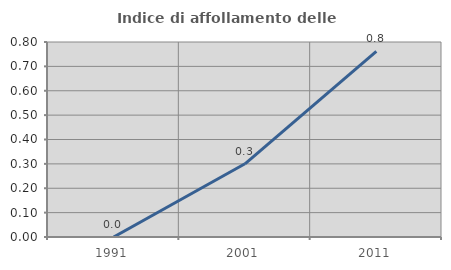
| Category | Indice di affollamento delle abitazioni  |
|---|---|
| 1991.0 | 0 |
| 2001.0 | 0.3 |
| 2011.0 | 0.761 |